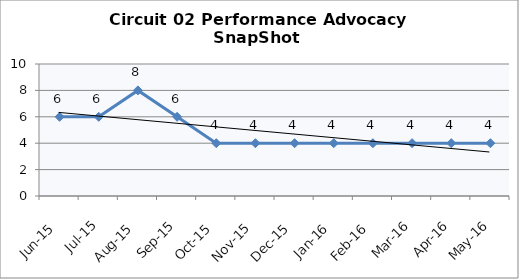
| Category | Circuit 02 |
|---|---|
| Jun-15 | 6 |
| Jul-15 | 6 |
| Aug-15 | 8 |
| Sep-15 | 6 |
| Oct-15 | 4 |
| Nov-15 | 4 |
| Dec-15 | 4 |
| Jan-16 | 4 |
| Feb-16 | 4 |
| Mar-16 | 4 |
| Apr-16 | 4 |
| May-16 | 4 |